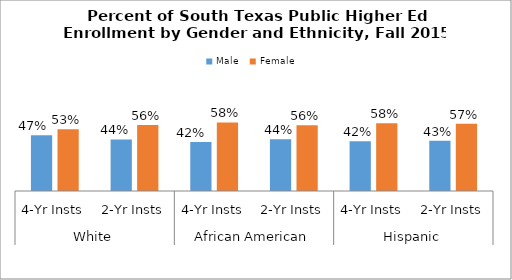
| Category | Male | Female |
|---|---|---|
| 0 | 0.474 | 0.526 |
| 1 | 0.439 | 0.561 |
| 2 | 0.417 | 0.583 |
| 3 | 0.44 | 0.56 |
| 4 | 0.424 | 0.576 |
| 5 | 0.427 | 0.573 |